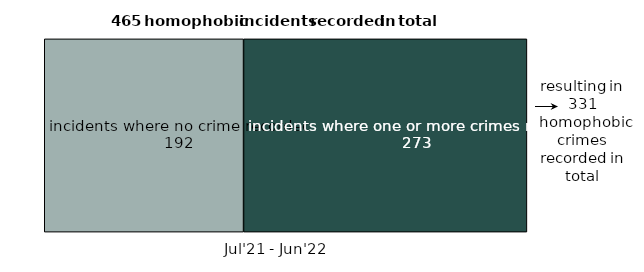
| Category | incidents where no crime recorded | incidents where one or more crimes recorded |
|---|---|---|
| 0 | 192 | 273 |